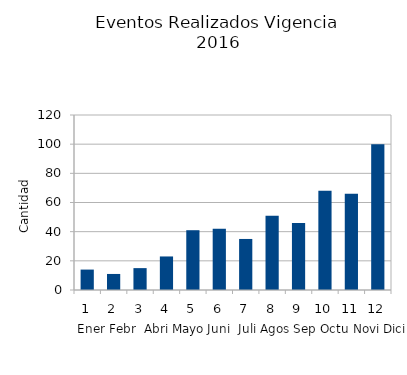
| Category | Series 0 |
|---|---|
| 0 | 14 |
| 1 | 11 |
| 2 | 15 |
| 3 | 23 |
| 4 | 41 |
| 5 | 42 |
| 6 | 35 |
| 7 | 51 |
| 8 | 46 |
| 9 | 68 |
| 10 | 66 |
| 11 | 100 |